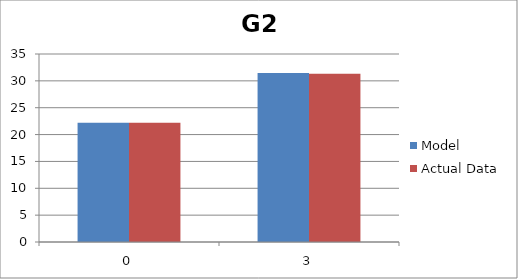
| Category | Model | Actual Data |
|---|---|---|
| 0.0 | 22.21 | 22.21 |
| 3.0 | 31.46 | 31.3 |